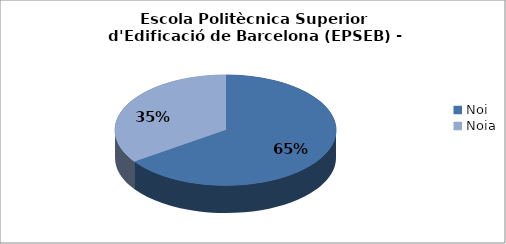
| Category | Escola Politècnica Superior d'Edificació de Barcelona (EPSEB) - Gènere |
|---|---|
| Noi | 0.654 |
| Noia | 0.346 |